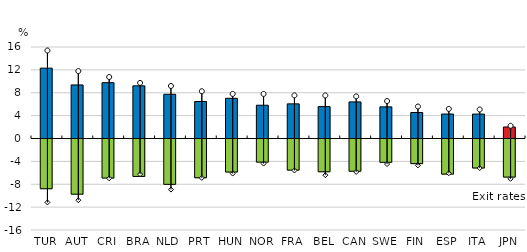
| Category | Entry rates: All sectors |
|---|---|
| TUR | -8.696 |
| AUT | -9.649 |
| CRI | -6.828 |
| BRA | -6.547 |
| NLD | -7.93 |
| PRT | -6.776 |
| HUN | -5.778 |
| NOR | -4.042 |
| FRA | -5.439 |
| BEL | -5.729 |
| CAN | -5.636 |
| SWE | -4.074 |
| FIN | -4.304 |
| ESP | -6.14 |
| ITA | -5.073 |
| JPN | -6.66 |